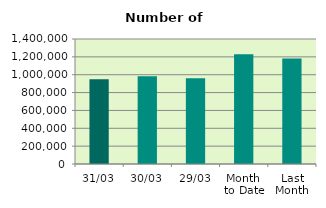
| Category | Series 0 |
|---|---|
| 31/03 | 949136 |
| 30/03 | 983674 |
| 29/03 | 960968 |
| Month 
to Date | 1228285.652 |
| Last
Month | 1180310.4 |